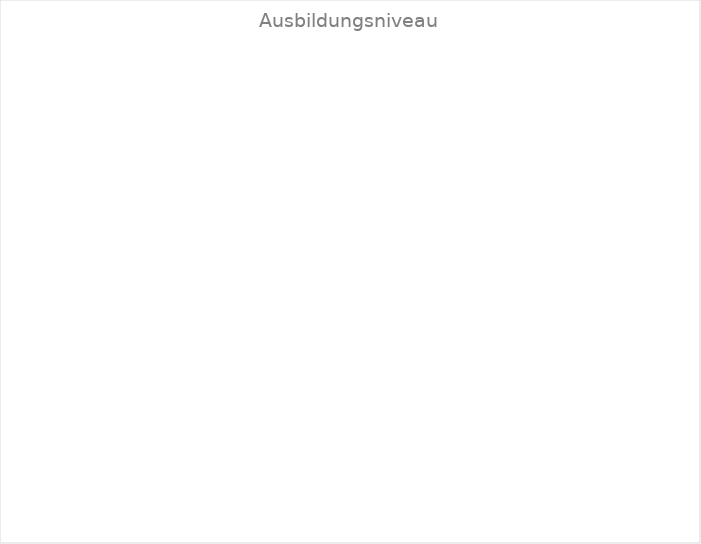
| Category | EFZ | Series 1 |
|---|---|---|
| EFZ | 0 | 0 |
| EBA | 0 | 0 |
| PrA | IV-Anlehre | 0 | 0 |
| Ausbildung in der Institutionn | 0 | 0 |
| Ausbildung in Kooperation mit dem 1. AM | 0 | 0 |
| Ausbildung im Lehrverbund des 1. AM | 0 | 0 |
| Suported Education | 0 | 0 |